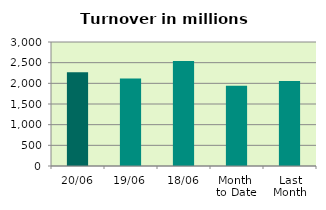
| Category | Series 0 |
|---|---|
| 20/06 | 2266.228 |
| 19/06 | 2116.227 |
| 18/06 | 2540.089 |
| Month 
to Date | 1939.548 |
| Last
Month | 2056.808 |